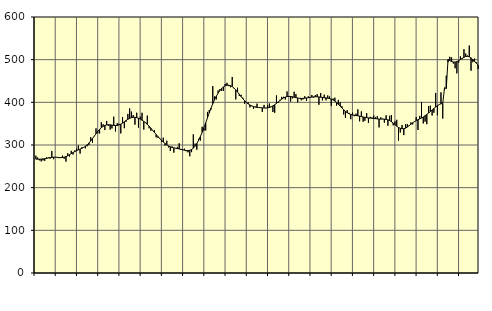
| Category | Piggar | Series 1 |
|---|---|---|
| nan | 274.9 | 266.76 |
| 1.0 | 270.7 | 266.76 |
| 1.0 | 264.1 | 266.82 |
| 1.0 | 261.5 | 266.96 |
| 1.0 | 264 | 267.32 |
| 1.0 | 262.8 | 267.86 |
| 1.0 | 271.2 | 268.57 |
| 1.0 | 270.6 | 269.52 |
| 1.0 | 268 | 270.36 |
| 1.0 | 285.9 | 271.01 |
| 1.0 | 266.7 | 271.34 |
| 1.0 | 271.1 | 271.36 |
| nan | 270.4 | 271.1 |
| 2.0 | 269.3 | 270.68 |
| 2.0 | 271.1 | 270.42 |
| 2.0 | 275.1 | 270.6 |
| 2.0 | 267.8 | 271.37 |
| 2.0 | 261.1 | 272.78 |
| 2.0 | 280.5 | 274.76 |
| 2.0 | 273 | 277.16 |
| 2.0 | 286.3 | 279.71 |
| 2.0 | 277.6 | 282.25 |
| 2.0 | 287.2 | 284.6 |
| 2.0 | 291.5 | 286.7 |
| nan | 298.7 | 288.58 |
| 3.0 | 279.9 | 290.39 |
| 3.0 | 294.8 | 292.26 |
| 3.0 | 295 | 294.38 |
| 3.0 | 292.2 | 297.07 |
| 3.0 | 297.1 | 300.49 |
| 3.0 | 299.8 | 304.65 |
| 3.0 | 318.4 | 309.52 |
| 3.0 | 304.8 | 315.02 |
| 3.0 | 320.2 | 320.77 |
| 3.0 | 339 | 326.52 |
| 3.0 | 327.5 | 331.91 |
| nan | 327.1 | 336.63 |
| 4.0 | 353.4 | 340.6 |
| 4.0 | 348.6 | 343.68 |
| 4.0 | 335 | 345.82 |
| 4.0 | 356.4 | 347.07 |
| 4.0 | 344.6 | 347.5 |
| 4.0 | 336 | 347.3 |
| 4.0 | 338.9 | 346.66 |
| 4.0 | 366.4 | 345.93 |
| 4.0 | 331.7 | 345.59 |
| 4.0 | 351.3 | 345.84 |
| 4.0 | 349.6 | 346.94 |
| nan | 327.2 | 348.92 |
| 5.0 | 365.4 | 351.48 |
| 5.0 | 339.4 | 354.41 |
| 5.0 | 354.5 | 357.47 |
| 5.0 | 372.9 | 360.26 |
| 5.0 | 385.8 | 362.48 |
| 5.0 | 378.4 | 364.04 |
| 5.0 | 370.1 | 364.9 |
| 5.0 | 347.7 | 364.9 |
| 5.0 | 375.6 | 364.09 |
| 5.0 | 340.6 | 362.66 |
| 5.0 | 366.5 | 360.66 |
| nan | 375.5 | 358.22 |
| 6.0 | 336.1 | 355.36 |
| 6.0 | 353.4 | 352.04 |
| 6.0 | 368.9 | 348.28 |
| 6.0 | 339.1 | 344.04 |
| 6.0 | 333.3 | 339.4 |
| 6.0 | 334 | 334.5 |
| 6.0 | 334.7 | 329.5 |
| 6.0 | 317.9 | 324.62 |
| 6.0 | 316.8 | 319.93 |
| 6.0 | 316.4 | 315.39 |
| 6.0 | 308.1 | 311.11 |
| nan | 317.1 | 307.07 |
| 7.0 | 298.7 | 303.42 |
| 7.0 | 310 | 300.32 |
| 7.0 | 294.5 | 297.73 |
| 7.0 | 286.1 | 295.71 |
| 7.0 | 296.6 | 294.33 |
| 7.0 | 282.1 | 293.29 |
| 7.0 | 292.7 | 292.37 |
| 7.0 | 295.6 | 291.51 |
| 7.0 | 303.9 | 290.65 |
| 7.0 | 290.8 | 289.76 |
| 7.0 | 290.6 | 288.76 |
| nan | 291.3 | 287.78 |
| 8.0 | 285.4 | 287.1 |
| 8.0 | 282.8 | 286.96 |
| 8.0 | 273.7 | 287.58 |
| 8.0 | 283.2 | 289.35 |
| 8.0 | 325 | 292.53 |
| 8.0 | 303.2 | 297.2 |
| 8.0 | 289 | 303.42 |
| 8.0 | 314.5 | 311.05 |
| 8.0 | 310.3 | 319.9 |
| 8.0 | 342.7 | 329.81 |
| 8.0 | 333.6 | 340.63 |
| nan | 334 | 352.04 |
| 9.0 | 377.6 | 363.68 |
| 9.0 | 382.2 | 375.25 |
| 9.0 | 383.2 | 386.45 |
| 9.0 | 438 | 396.85 |
| 9.0 | 413.8 | 406.14 |
| 9.0 | 406.9 | 414.33 |
| 9.0 | 427.8 | 421.45 |
| 9.0 | 430.9 | 427.51 |
| 9.0 | 426.6 | 432.4 |
| 9.0 | 427 | 436.12 |
| 9.0 | 443 | 438.66 |
| nan | 445.8 | 440.07 |
| 10.0 | 438 | 440.26 |
| 10.0 | 435.3 | 439.14 |
| 10.0 | 459.4 | 436.83 |
| 10.0 | 432.9 | 433.5 |
| 10.0 | 406.9 | 429.27 |
| 10.0 | 434.3 | 424.32 |
| 10.0 | 415.1 | 418.98 |
| 10.0 | 417.6 | 413.55 |
| 10.0 | 410.9 | 408.44 |
| 10.0 | 396.5 | 403.85 |
| 10.0 | 399.8 | 399.89 |
| nan | 400.1 | 396.52 |
| 11.0 | 388.2 | 393.74 |
| 11.0 | 392.4 | 391.54 |
| 11.0 | 384.5 | 389.89 |
| 11.0 | 390.2 | 388.8 |
| 11.0 | 396.9 | 388.16 |
| 11.0 | 387.1 | 387.78 |
| 11.0 | 387 | 387.43 |
| 11.0 | 377.5 | 387.1 |
| 11.0 | 393.9 | 386.81 |
| 11.0 | 386.2 | 386.76 |
| 11.0 | 392.9 | 387.07 |
| nan | 397.2 | 387.9 |
| 12.0 | 390.7 | 389.4 |
| 12.0 | 377.3 | 391.64 |
| 12.0 | 375.6 | 394.47 |
| 12.0 | 416.2 | 397.66 |
| 12.0 | 398.5 | 401.02 |
| 12.0 | 406.1 | 404.36 |
| 12.0 | 412.8 | 407.5 |
| 12.0 | 412.9 | 410.23 |
| 12.0 | 406.6 | 412.3 |
| 12.0 | 425.4 | 413.56 |
| 12.0 | 412.5 | 414 |
| nan | 401.7 | 413.72 |
| 13.0 | 409.2 | 412.94 |
| 13.0 | 424.8 | 411.95 |
| 13.0 | 419.3 | 410.99 |
| 13.0 | 400.1 | 410.14 |
| 13.0 | 409.2 | 409.51 |
| 13.0 | 404.8 | 409.24 |
| 13.0 | 406.9 | 409.34 |
| 13.0 | 414.3 | 409.71 |
| 13.0 | 403.3 | 410.31 |
| 13.0 | 413.9 | 411 |
| 13.0 | 412.4 | 411.63 |
| nan | 417.2 | 412.27 |
| 14.0 | 411 | 412.8 |
| 14.0 | 416.9 | 413.02 |
| 14.0 | 419 | 412.92 |
| 14.0 | 394.3 | 412.59 |
| 14.0 | 421.9 | 412.09 |
| 14.0 | 404.5 | 411.47 |
| 14.0 | 417.8 | 410.85 |
| 14.0 | 404.7 | 410.3 |
| 14.0 | 416.1 | 409.69 |
| 14.0 | 413.6 | 408.83 |
| 14.0 | 391.7 | 407.54 |
| nan | 408.8 | 405.63 |
| 15.0 | 410.9 | 403 |
| 15.0 | 392.3 | 399.64 |
| 15.0 | 405.8 | 395.61 |
| 15.0 | 400.1 | 391.23 |
| 15.0 | 391.1 | 386.78 |
| 15.0 | 371.5 | 382.51 |
| 15.0 | 363.9 | 378.78 |
| 15.0 | 381.5 | 375.67 |
| 15.0 | 375.5 | 373.3 |
| 15.0 | 360.5 | 371.62 |
| 15.0 | 376 | 370.52 |
| nan | 367.5 | 369.79 |
| 16.0 | 373.3 | 369.13 |
| 16.0 | 383.6 | 368.38 |
| 16.0 | 355.5 | 367.58 |
| 16.0 | 378.7 | 366.65 |
| 16.0 | 354.5 | 365.66 |
| 16.0 | 356.8 | 364.79 |
| 16.0 | 374.8 | 364.06 |
| 16.0 | 351.6 | 363.51 |
| 16.0 | 366 | 363.02 |
| 16.0 | 364.5 | 362.55 |
| 16.0 | 369.1 | 362.12 |
| nan | 365 | 361.68 |
| 17.0 | 367.6 | 361.21 |
| 17.0 | 341.3 | 360.86 |
| 17.0 | 364.6 | 360.71 |
| 17.0 | 361.5 | 360.66 |
| 17.0 | 352.4 | 360.52 |
| 17.0 | 369.6 | 360.06 |
| 17.0 | 345.2 | 358.99 |
| 17.0 | 368.6 | 357.13 |
| 17.0 | 370.1 | 354.54 |
| 17.0 | 346 | 351.31 |
| 17.0 | 355.6 | 347.74 |
| nan | 359.1 | 344.17 |
| 18.0 | 310.2 | 341.18 |
| 18.0 | 329.3 | 339.14 |
| 18.0 | 346.9 | 338.13 |
| 18.0 | 323.2 | 338.24 |
| 18.0 | 348.8 | 339.58 |
| 18.0 | 348.9 | 342.1 |
| 18.0 | 344.6 | 345.32 |
| 18.0 | 352.9 | 348.72 |
| 18.0 | 348.2 | 351.92 |
| 18.0 | 355.5 | 354.77 |
| 18.0 | 365.2 | 357.13 |
| nan | 335.2 | 359.14 |
| 19.0 | 368.2 | 361.12 |
| 19.0 | 401 | 363.22 |
| 19.0 | 350.6 | 365.65 |
| 19.0 | 354.7 | 368.52 |
| 19.0 | 348.7 | 371.7 |
| 19.0 | 391.4 | 375.07 |
| 19.0 | 392.1 | 378.57 |
| 19.0 | 369.2 | 382.11 |
| 19.0 | 375.6 | 385.59 |
| 19.0 | 422 | 388.96 |
| 19.0 | 369.7 | 392.13 |
| nan | 395 | 394.81 |
| 20.0 | 423.4 | 396.61 |
| 20.0 | 361.9 | 397.18 |
| 20.0 | 429 | 434.05 |
| 20.0 | 462.5 | 432.48 |
| 20.0 | 494.2 | 500.21 |
| 20.0 | 506.7 | 497.81 |
| 20.0 | 505.2 | 495.69 |
| 20.0 | 490.9 | 494.46 |
| 20.0 | 479.8 | 494.41 |
| 20.0 | 467.9 | 495.47 |
| 20.0 | 493.1 | 497.48 |
| nan | 507.8 | 500.23 |
| 21.0 | 501.2 | 503.1 |
| 21.0 | 524.5 | 505.63 |
| 21.0 | 514.3 | 507.43 |
| 21.0 | 509.4 | 507.86 |
| 21.0 | 533 | 506.69 |
| 21.0 | 474.1 | 504.09 |
| 21.0 | 494 | 500.31 |
| 21.0 | 502.7 | 495.91 |
| 21.0 | 493.6 | 491.47 |
| 21.0 | 478 | 487.47 |